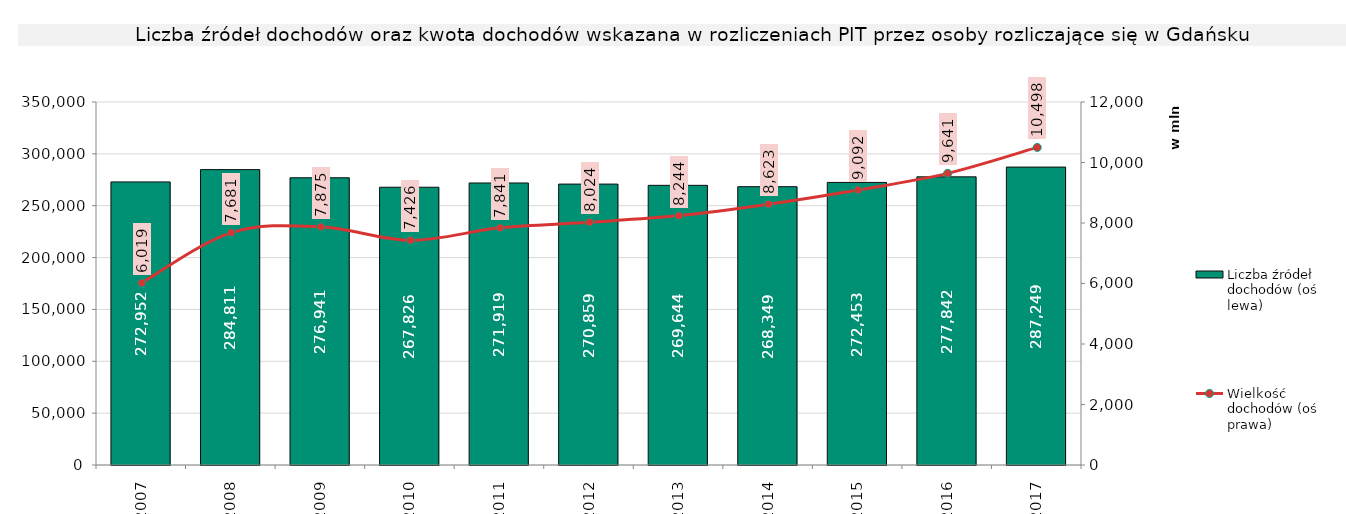
| Category | Liczba źródeł dochodów (oś lewa) |
|---|---|
| 2007.0 | 272952 |
| 2008.0 | 284811 |
| 2009.0 | 276941 |
| 2010.0 | 267826 |
| 2011.0 | 271919 |
| 2012.0 | 270859 |
| 2013.0 | 269644 |
| 2014.0 | 268349 |
| 2015.0 | 272453 |
| 2016.0 | 277842 |
| 2017.0 | 287249 |